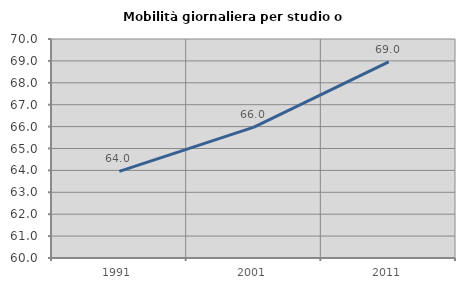
| Category | Mobilità giornaliera per studio o lavoro |
|---|---|
| 1991.0 | 63.953 |
| 2001.0 | 65.973 |
| 2011.0 | 68.956 |